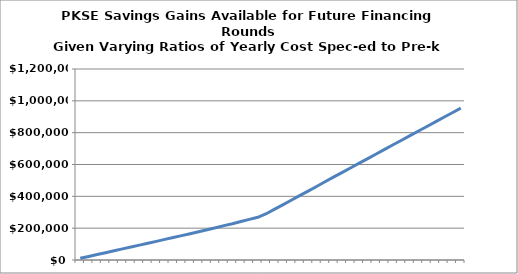
| Category | Present value of PKSE savings gains available to school district |
|---|---|
| 0.6369426751592356 | 10590.882 |
| 0.7006369426751592 | 22321.163 |
| 0.7643312101910829 | 34074.557 |
| 0.8280254777070064 | 46097.108 |
| 0.89171974522293 | 57871.206 |
| 0.9554140127388535 | 69969.197 |
| 1.019108280254777 | 81764.888 |
| 1.0828025477707006 | 93560.579 |
| 1.1464968152866242 | 105356.27 |
| 1.2101910828025477 | 117151.961 |
| 1.2738853503184713 | 129369.159 |
| 1.3375796178343948 | 141185.925 |
| 1.4012738853503184 | 153002.692 |
| 1.464968152866242 | 164873.16 |
| 1.5286624203821657 | 176939.206 |
| 1.5923566878980893 | 190206.402 |
| 1.6560509554140128 | 202320.494 |
| 1.7197452229299364 | 215918.968 |
| 1.78343949044586 | 228088.037 |
| 1.8471337579617835 | 242237.092 |
| 1.910828025477707 | 255442.283 |
| 1.9745222929936306 | 268393.731 |
| 2.038216560509554 | 290705.605 |
| 2.1019108280254777 | 319485.77 |
| 2.1656050955414012 | 348265.936 |
| 2.229299363057325 | 377046.102 |
| 2.2929936305732483 | 405826.268 |
| 2.356687898089172 | 434606.434 |
| 2.4203821656050954 | 463386.6 |
| 2.484076433121019 | 493266.329 |
| 2.5477707006369426 | 522074.689 |
| 2.611464968152866 | 550883.049 |
| 2.6751592356687897 | 579691.409 |
| 2.738853503184713 | 608499.769 |
| 2.8025477707006368 | 637308.128 |
| 2.8662420382165603 | 666116.488 |
| 2.929936305732484 | 694924.848 |
| 2.9936305732484074 | 723733.208 |
| 3.0573248407643314 | 752541.568 |
| 3.121019108280255 | 781349.928 |
| 3.1847133757961785 | 810158.287 |
| 3.248407643312102 | 838966.647 |
| 3.3121019108280256 | 867775.007 |
| 3.375796178343949 | 896583.367 |
| 3.4394904458598727 | 925391.727 |
| 3.5031847133757963 | 954200.086 |